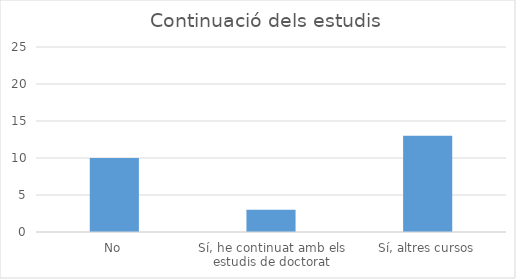
| Category | Series 0 |
|---|---|
| No | 10 |
| Sí, he continuat amb els estudis de doctorat | 3 |
| Sí, altres cursos | 13 |